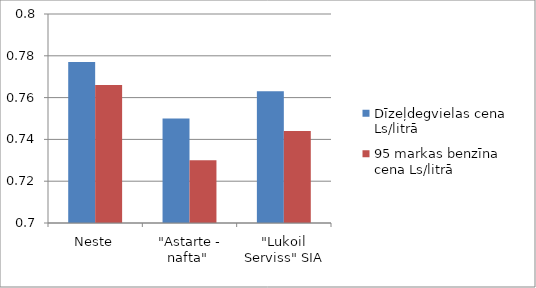
| Category | Dīzeļdegvielas cena Ls/litrā | 95 markas benzīna cena Ls/litrā |
|---|---|---|
| Neste | 0.777 | 0.766 |
| "Astarte - nafta"  | 0.75 | 0.73 |
| "Lukoil Serviss" SIA | 0.763 | 0.744 |